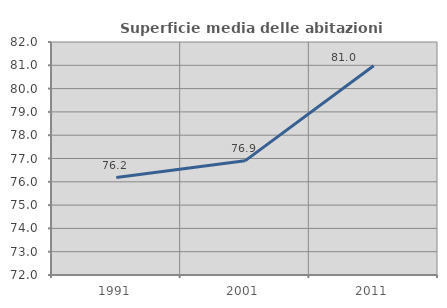
| Category | Superficie media delle abitazioni occupate |
|---|---|
| 1991.0 | 76.184 |
| 2001.0 | 76.899 |
| 2011.0 | 80.978 |